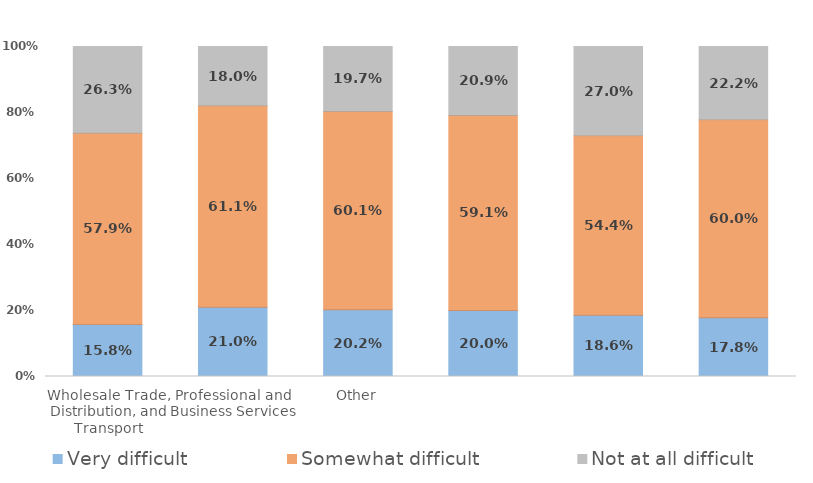
| Category | Very difficult | Somewhat difficult | Not at all difficult |
|---|---|---|---|
| Wholesale Trade, Distribution, and Transport | 0.158 | 0.579 | 0.263 |
| Professional and Business Services | 0.21 | 0.611 | 0.18 |
| Other | 0.202 | 0.601 | 0.197 |